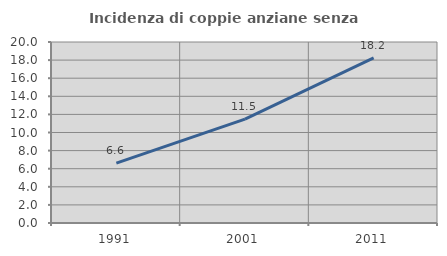
| Category | Incidenza di coppie anziane senza figli  |
|---|---|
| 1991.0 | 6.623 |
| 2001.0 | 11.482 |
| 2011.0 | 18.239 |